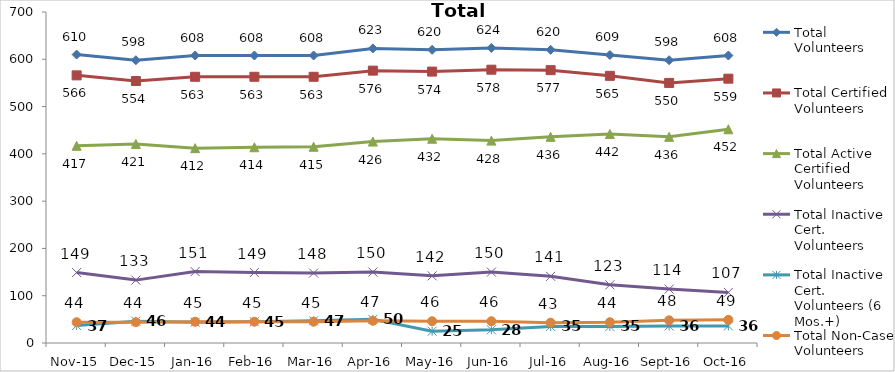
| Category | Total Volunteers | Total Certified Volunteers | Total Active Certified Volunteers | Total Inactive Cert. Volunteers | Total Inactive Cert. Volunteers (6 Mos.+) | Total Non-Case Volunteers |
|---|---|---|---|---|---|---|
| Nov-15 | 610 | 566 | 417 | 149 | 37 | 44 |
| Dec-15 | 598 | 554 | 421 | 133 | 46 | 44 |
| Jan-16 | 608 | 563 | 412 | 151 | 44 | 45 |
| Feb-16 | 608 | 563 | 414 | 149 | 45 | 45 |
| Mar-16 | 608 | 563 | 415 | 148 | 47 | 45 |
| Apr-16 | 623 | 576 | 426 | 150 | 50 | 47 |
| May-16 | 620 | 574 | 432 | 142 | 25 | 46 |
| Jun-16 | 624 | 578 | 428 | 150 | 28 | 46 |
| Jul-16 | 620 | 577 | 436 | 141 | 35 | 43 |
| Aug-16 | 609 | 565 | 442 | 123 | 35 | 44 |
| Sep-16 | 598 | 550 | 436 | 114 | 36 | 48 |
| Oct-16 | 608 | 559 | 452 | 107 | 36 | 49 |